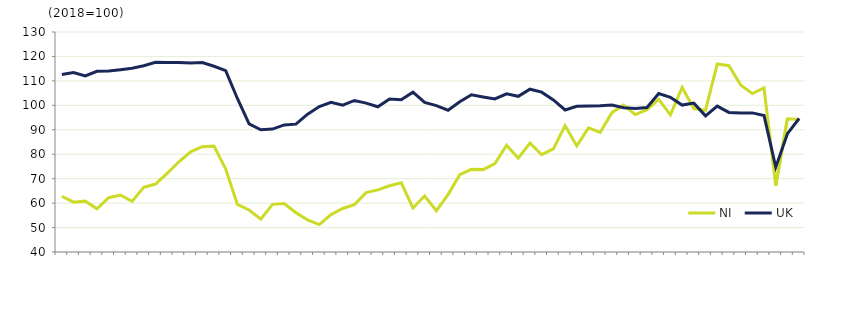
| Category | NI  | UK  |
|---|---|---|
|  | 62.8 | 112.6 |
| Q2 2005 | 60.4 | 113.4 |
|  | 60.8 | 112 |
| Q4 2005 | 57.7 | 113.9 |
|  | 62.2 | 114 |
| Q2 2006 | 63.3 | 114.6 |
|  | 60.7 | 115.2 |
| Q4 2006 | 66.5 | 116.2 |
|  | 67.8 | 117.6 |
| Q2 2007 | 72.2 | 117.5 |
|  | 76.9 | 117.5 |
| Q4 2007 | 81 | 117.3 |
|  | 83.1 | 117.5 |
| Q2 2008 | 83.3 | 116 |
|  | 73.9 | 114.2 |
| Q4 2008 | 59.5 | 102.8 |
|  | 57.2 | 92.4 |
| Q2 2009 | 53.4 | 90 |
|  | 59.5 | 90.3 |
| Q4 2009 | 59.8 | 92 |
|  | 56.1 | 92.3 |
| Q2 2010 | 53.1 | 96.4 |
|  | 51.2 | 99.5 |
| Q4 2010 | 55.3 | 101.2 |
|  | 57.8 | 100.1 |
| Q2 2011 | 59.4 | 102 |
|  | 64.3 | 100.9 |
| Q4 2011 | 65.4 | 99.4 |
|  | 67.1 | 102.6 |
| Q2 2012 | 68.3 | 102.3 |
|  | 58 | 105.4 |
| Q4 2012 | 62.9 | 101.2 |
|  | 56.9 | 99.9 |
| Q2 2013 | 63.5 | 98 |
|  | 71.6 | 101.5 |
| Q4 2013 | 73.8 | 104.3 |
|  | 73.7 | 103.4 |
| Q2 2014 | 76.2 | 102.6 |
|  | 83.7 | 104.7 |
| Q4 2014 | 78.4 | 103.7 |
|  | 84.6 | 106.6 |
| Q2 2015 | 79.8 | 105.4 |
|  | 82.2 | 102.2 |
| Q4 2015 | 91.7 | 98.1 |
|  | 83.4 | 99.6 |
| Q2 2016 | 90.8 | 99.7 |
|  | 88.9 | 99.8 |
| Q4 2016 | 97 | 100.1 |
|  | 100.1 | 99 |
| Q2 2017 | 96.2 | 98.7 |
|  | 98.2 | 99.1 |
| Q4 2017 | 102.4 | 104.8 |
|  | 96.1 | 103.3 |
| Q2 2018 | 107.3 | 100.1 |
|  | 98.7 | 100.9 |
| Q4 2018 | 98 | 95.7 |
|  | 116.9 | 99.7 |
| Q2 2019 | 116.2 | 97.1 |
|  | 108.3 | 96.9 |
| Q4 2019 | 104.8 | 96.9 |
|  | 107.1 | 95.8 |
| Q2 2020 | 67.1 | 74.7 |
|  | 94.5 | 88.4 |
| Q4 2020 | 94.2 | 94.6 |